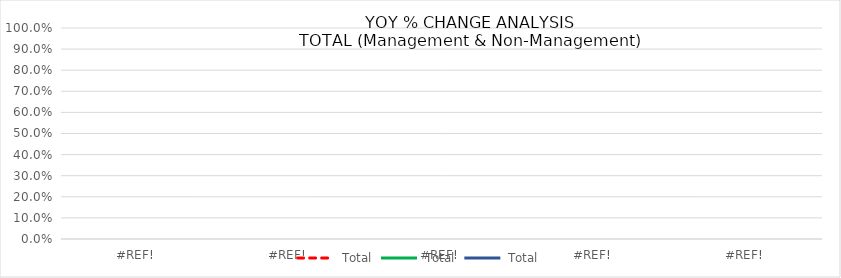
| Category | FTE | SALARY | BENEFITS |
|---|---|---|---|
| 0.0 | 0 | 0 | 0 |
| 0.0 | 0 | 0 | 0 |
| 0.0 | 0 | 0 | 0 |
| 0.0 | 0 | 0 | 0 |
| 0.0 | 0 | 0 | 0 |